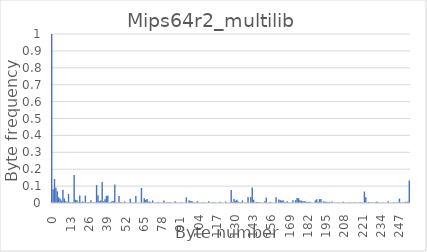
| Category | Series 0 |
|---|---|
| 0.0 | 1 |
| 1.0 | 0.081 |
| 2.0 | 0.142 |
| 3.0 | 0.09 |
| 4.0 | 0.069 |
| 5.0 | 0.034 |
| 6.0 | 0.025 |
| 7.0 | 0.014 |
| 8.0 | 0.079 |
| 9.0 | 0.027 |
| 10.0 | 0.011 |
| 11.0 | 0.006 |
| 12.0 | 0.053 |
| 13.0 | 0.004 |
| 14.0 | 0.004 |
| 15.0 | 0.005 |
| 16.0 | 0.166 |
| 17.0 | 0.019 |
| 18.0 | 0.016 |
| 19.0 | 0.006 |
| 20.0 | 0.044 |
| 21.0 | 0.005 |
| 22.0 | 0.01 |
| 23.0 | 0.005 |
| 24.0 | 0.044 |
| 25.0 | 0.004 |
| 26.0 | 0.004 |
| 27.0 | 0.003 |
| 28.0 | 0.016 |
| 29.0 | 0.002 |
| 30.0 | 0.005 |
| 31.0 | 0.003 |
| 32.0 | 0.106 |
| 33.0 | 0.046 |
| 34.0 | 0.01 |
| 35.0 | 0.014 |
| 36.0 | 0.124 |
| 37.0 | 0.01 |
| 38.0 | 0.022 |
| 39.0 | 0.042 |
| 40.0 | 0.044 |
| 41.0 | 0.003 |
| 42.0 | 0.005 |
| 43.0 | 0.011 |
| 44.0 | 0.012 |
| 45.0 | 0.109 |
| 46.0 | 0.002 |
| 47.0 | 0.003 |
| 48.0 | 0.041 |
| 49.0 | 0.005 |
| 50.0 | 0.004 |
| 51.0 | 0.002 |
| 52.0 | 0.009 |
| 53.0 | 0.002 |
| 54.0 | 0.002 |
| 55.0 | 0.001 |
| 56.0 | 0.025 |
| 57.0 | 0.004 |
| 58.0 | 0.002 |
| 59.0 | 0.004 |
| 60.0 | 0.041 |
| 61.0 | 0.001 |
| 62.0 | 0.002 |
| 63.0 | 0.002 |
| 64.0 | 0.089 |
| 65.0 | 0.003 |
| 66.0 | 0.027 |
| 67.0 | 0.019 |
| 68.0 | 0.023 |
| 69.0 | 0.007 |
| 70.0 | 0.009 |
| 71.0 | 0.003 |
| 72.0 | 0.015 |
| 73.0 | 0.002 |
| 74.0 | 0.002 |
| 75.0 | 0.002 |
| 76.0 | 0.007 |
| 77.0 | 0.001 |
| 78.0 | 0.001 |
| 79.0 | 0.001 |
| 80.0 | 0.014 |
| 81.0 | 0.003 |
| 82.0 | 0.004 |
| 83.0 | 0.002 |
| 84.0 | 0.005 |
| 85.0 | 0.002 |
| 86.0 | 0.002 |
| 87.0 | 0.002 |
| 88.0 | 0.01 |
| 89.0 | 0.002 |
| 90.0 | 0.001 |
| 91.0 | 0.001 |
| 92.0 | 0.004 |
| 93.0 | 0.001 |
| 94.0 | 0.002 |
| 95.0 | 0.001 |
| 96.0 | 0.033 |
| 97.0 | 0.001 |
| 98.0 | 0.017 |
| 99.0 | 0.011 |
| 100.0 | 0.012 |
| 101.0 | 0.005 |
| 102.0 | 0.003 |
| 103.0 | 0.002 |
| 104.0 | 0.01 |
| 105.0 | 0.001 |
| 106.0 | 0.002 |
| 107.0 | 0.001 |
| 108.0 | 0.004 |
| 109.0 | 0.001 |
| 110.0 | 0.001 |
| 111.0 | 0.001 |
| 112.0 | 0.01 |
| 113.0 | 0.002 |
| 114.0 | 0.002 |
| 115.0 | 0.003 |
| 116.0 | 0.004 |
| 117.0 | 0.001 |
| 118.0 | 0.001 |
| 119.0 | 0.001 |
| 120.0 | 0.008 |
| 121.0 | 0.002 |
| 122.0 | 0.001 |
| 123.0 | 0.001 |
| 124.0 | 0.008 |
| 125.0 | 0.001 |
| 126.0 | 0.002 |
| 127.0 | 0.002 |
| 128.0 | 0.077 |
| 129.0 | 0.007 |
| 130.0 | 0.023 |
| 131.0 | 0.013 |
| 132.0 | 0.019 |
| 133.0 | 0.009 |
| 134.0 | 0.005 |
| 135.0 | 0.004 |
| 136.0 | 0.015 |
| 137.0 | 0.002 |
| 138.0 | 0.002 |
| 139.0 | 0.002 |
| 140.0 | 0.035 |
| 141.0 | 0.003 |
| 142.0 | 0.036 |
| 143.0 | 0.092 |
| 144.0 | 0.019 |
| 145.0 | 0.003 |
| 146.0 | 0.007 |
| 147.0 | 0.004 |
| 148.0 | 0.006 |
| 149.0 | 0.002 |
| 150.0 | 0.002 |
| 151.0 | 0.002 |
| 152.0 | 0.01 |
| 153.0 | 0.033 |
| 154.0 | 0.001 |
| 155.0 | 0.001 |
| 156.0 | 0.007 |
| 157.0 | 0.001 |
| 158.0 | 0.001 |
| 159.0 | 0.001 |
| 160.0 | 0.035 |
| 161.0 | 0.001 |
| 162.0 | 0.021 |
| 163.0 | 0.017 |
| 164.0 | 0.014 |
| 165.0 | 0.017 |
| 166.0 | 0.007 |
| 167.0 | 0.005 |
| 168.0 | 0.01 |
| 169.0 | 0.003 |
| 170.0 | 0.003 |
| 171.0 | 0.002 |
| 172.0 | 0.016 |
| 173.0 | 0.002 |
| 174.0 | 0.016 |
| 175.0 | 0.029 |
| 176.0 | 0.029 |
| 177.0 | 0.017 |
| 178.0 | 0.014 |
| 179.0 | 0.011 |
| 180.0 | 0.011 |
| 181.0 | 0.008 |
| 182.0 | 0.007 |
| 183.0 | 0.006 |
| 184.0 | 0.007 |
| 185.0 | 0.003 |
| 186.0 | 0.001 |
| 187.0 | 0.001 |
| 188.0 | 0.015 |
| 189.0 | 0.022 |
| 190.0 | 0.006 |
| 191.0 | 0.023 |
| 192.0 | 0.023 |
| 193.0 | 0.001 |
| 194.0 | 0.01 |
| 195.0 | 0.007 |
| 196.0 | 0.007 |
| 197.0 | 0.004 |
| 198.0 | 0.007 |
| 199.0 | 0.003 |
| 200.0 | 0.008 |
| 201.0 | 0.002 |
| 202.0 | 0.002 |
| 203.0 | 0.001 |
| 204.0 | 0.004 |
| 205.0 | 0.001 |
| 206.0 | 0.001 |
| 207.0 | 0.001 |
| 208.0 | 0.007 |
| 209.0 | 0.002 |
| 210.0 | 0.002 |
| 211.0 | 0.001 |
| 212.0 | 0.005 |
| 213.0 | 0.001 |
| 214.0 | 0.002 |
| 215.0 | 0.002 |
| 216.0 | 0.004 |
| 217.0 | 0.003 |
| 218.0 | 0.001 |
| 219.0 | 0.001 |
| 220.0 | 0.006 |
| 221.0 | 0.001 |
| 222.0 | 0.003 |
| 223.0 | 0.068 |
| 224.0 | 0.034 |
| 225.0 | 0.001 |
| 226.0 | 0.005 |
| 227.0 | 0.003 |
| 228.0 | 0.004 |
| 229.0 | 0.002 |
| 230.0 | 0.002 |
| 231.0 | 0.005 |
| 232.0 | 0.009 |
| 233.0 | 0.001 |
| 234.0 | 0.001 |
| 235.0 | 0.001 |
| 236.0 | 0.003 |
| 237.0 | 0.001 |
| 238.0 | 0.001 |
| 239.0 | 0.002 |
| 240.0 | 0.01 |
| 241.0 | 0.002 |
| 242.0 | 0.002 |
| 243.0 | 0.002 |
| 244.0 | 0.005 |
| 245.0 | 0.002 |
| 246.0 | 0.002 |
| 247.0 | 0.004 |
| 248.0 | 0.026 |
| 249.0 | 0.002 |
| 250.0 | 0.003 |
| 251.0 | 0.003 |
| 252.0 | 0.008 |
| 253.0 | 0.004 |
| 254.0 | 0.009 |
| 255.0 | 0.133 |